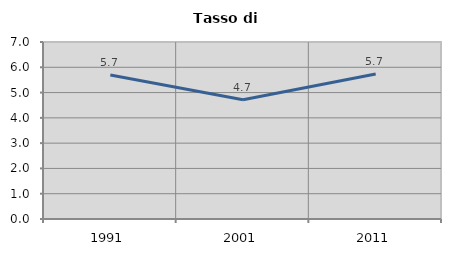
| Category | Tasso di disoccupazione   |
|---|---|
| 1991.0 | 5.696 |
| 2001.0 | 4.716 |
| 2011.0 | 5.735 |